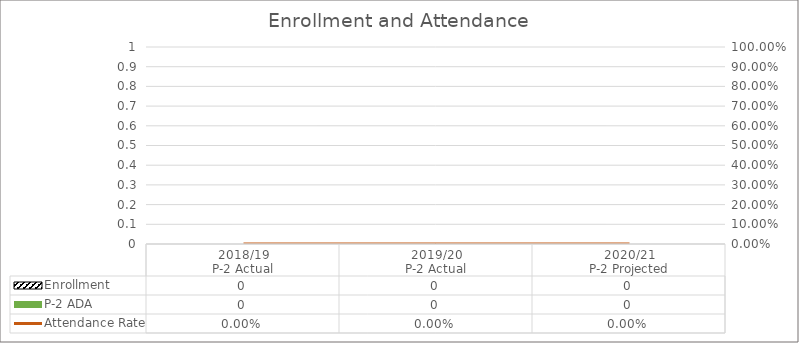
| Category | Enrollment | P-2 ADA |
|---|---|---|
| 2018/19
P-2 Actual | 0 | 0 |
| 2019/20
P-2 Actual | 0 | 0 |
| 2020/21
P-2 Projected | 0 | 0 |